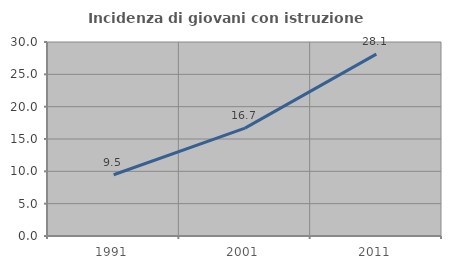
| Category | Incidenza di giovani con istruzione universitaria |
|---|---|
| 1991.0 | 9.473 |
| 2001.0 | 16.675 |
| 2011.0 | 28.123 |